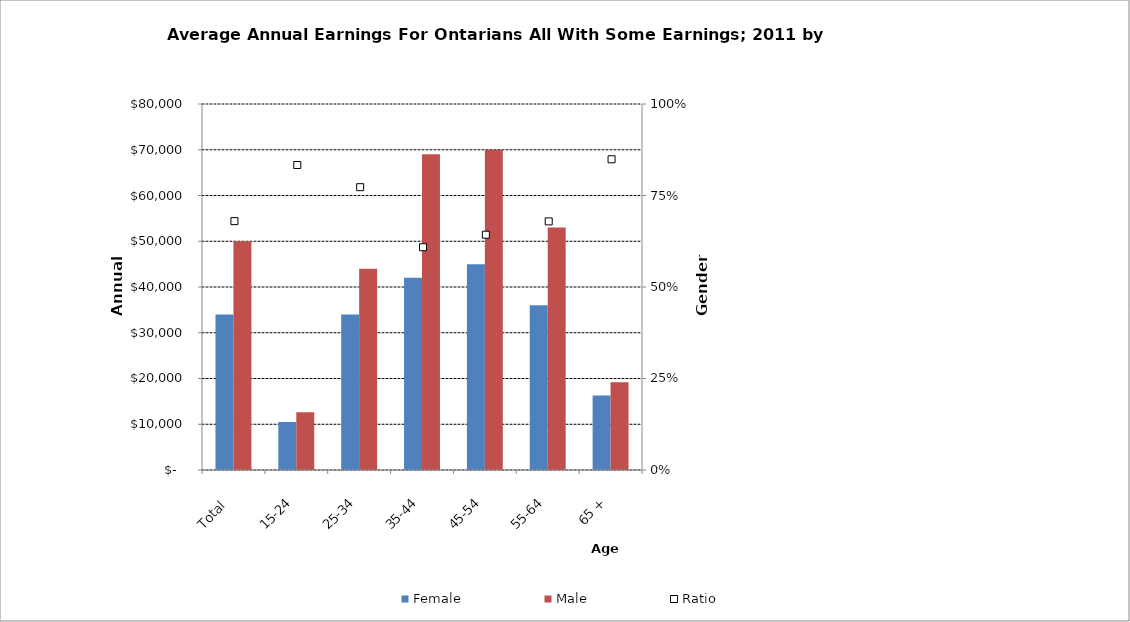
| Category | Female | Male |
|---|---|---|
| Total | 34000 | 50000 |
|  15-24  | 10500 | 12600 |
|  25-34  | 34000 | 44000 |
|  35-44  | 42000 | 69000 |
|  45-54  | 45000 | 70000 |
|  55-64  | 36000 | 53000 |
|  65 +  | 16300 | 19200 |